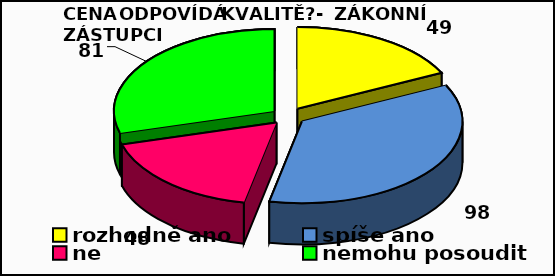
| Category | Series 0 |
|---|---|
| rozhodně ano | 49 |
| spíše ano | 98 |
| ne | 48 |
| nemohu posoudit | 81 |